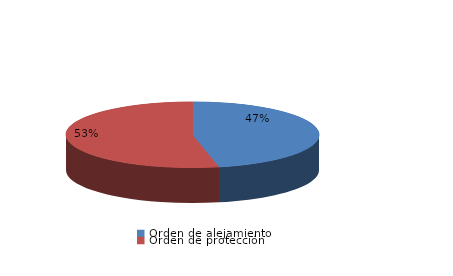
| Category | Series 0 |
|---|---|
| Orden de alejamiento | 21 |
| Orden de protección | 24 |